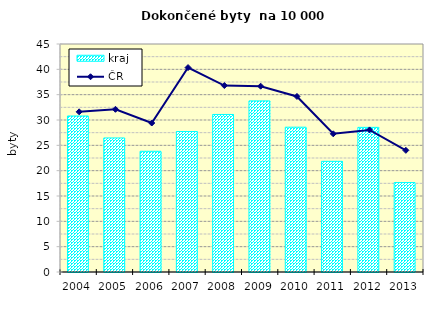
| Category | kraj |
|---|---|
| 2004.0 | 30.791 |
| 2005.0 | 26.455 |
| 2006.0 | 23.825 |
| 2007.0 | 27.724 |
| 2008.0 | 31.093 |
| 2009.0 | 33.772 |
| 2010.0 | 28.579 |
| 2011.0 | 21.843 |
| 2012.0 | 28.546 |
| 2013.0 | 17.652 |